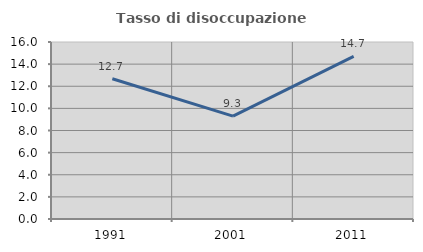
| Category | Tasso di disoccupazione giovanile  |
|---|---|
| 1991.0 | 12.676 |
| 2001.0 | 9.302 |
| 2011.0 | 14.706 |